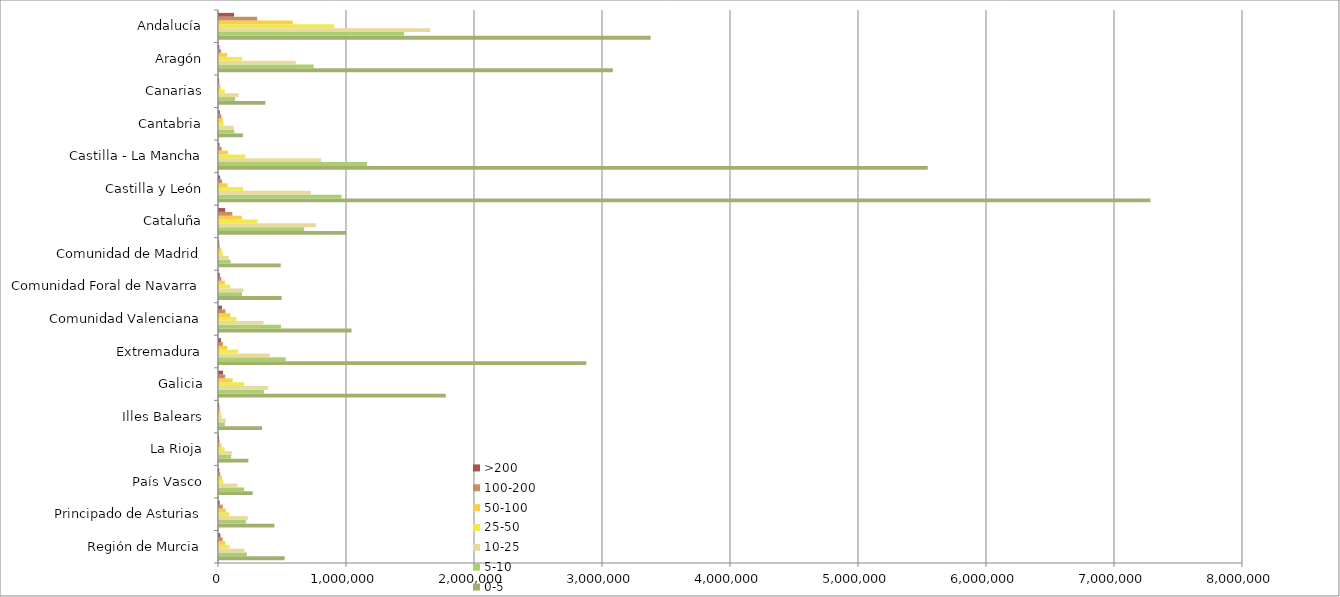
| Category | 0-5 | 5-10 | 10-25 | 25-50 | 50-100 | 100-200 | >200 |
|---|---|---|---|---|---|---|---|
| Región de Murcia | 513374.062 | 217704.375 | 199480.688 | 82841.562 | 49019.688 | 27427.75 | 10923.75 |
| Principado de Asturias | 432749.5 | 209614.5 | 224810.438 | 80668.875 | 54469.688 | 29366.938 | 5830.125 |
| País Vasco | 263001.25 | 196473.188 | 144175.438 | 34783.375 | 23761.875 | 9808 | 2532.188 |
| La Rioja | 229571.25 | 94498.938 | 100528.25 | 44037.938 | 18434.5 | 4431.188 | 616.875 |
| Illes Balears | 336935.875 | 45378.812 | 53132.625 | 22736.562 | 11762.438 | 4325.25 | 1709.312 |
| Galicia | 1771574.938 | 350275.812 | 384631.25 | 197208.25 | 106493.312 | 48652.938 | 31597.562 |
| Extremadura | 2869803.75 | 520722.75 | 396891.062 | 150297.25 | 64257.875 | 29711.125 | 16187.438 |
| Comunidad Valenciana | 1035034.688 | 485179 | 347587.875 | 136956.125 | 89153.812 | 50269.625 | 22861.438 |
| Comunidad Foral de Navarra | 489578.625 | 179637.312 | 191515.062 | 88171.25 | 46617.688 | 17695.5 | 6247.688 |
| Comunidad de Madrid | 482568.5 | 90648.625 | 75677.125 | 29501.5 | 17803.688 | 5701.625 | 1420.312 |
| Cataluña | 993346.062 | 665276.312 | 757774.5 | 300560.312 | 179212 | 104098.375 | 48371.375 |
| Castilla y León | 7276799 | 957377.25 | 717298.875 | 187322.625 | 66978.062 | 23393.562 | 8822.438 |
| Castilla - La Mancha | 5537070.562 | 1155778 | 797717.938 | 206442.625 | 71333.188 | 20509.188 | 3912.188 |
| Cantabria | 186656.375 | 119926.938 | 114549.25 | 35491.938 | 29537.375 | 18789.312 | 6709.812 |
| Canarias | 362072.312 | 125541.938 | 153539.688 | 45824.062 | 12763.375 | 3181 | 502.438 |
| Aragón | 3076694.75 | 739427.5 | 599776 | 181930.688 | 63840.812 | 16761.312 | 3029 |
| Andalucía | 3372329.875 | 1445363.812 | 1650519.562 | 899151.312 | 575854.75 | 297690.125 | 117900.562 |